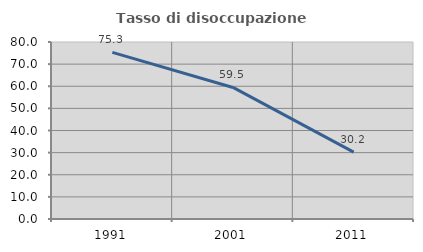
| Category | Tasso di disoccupazione giovanile  |
|---|---|
| 1991.0 | 75.309 |
| 2001.0 | 59.459 |
| 2011.0 | 30.233 |